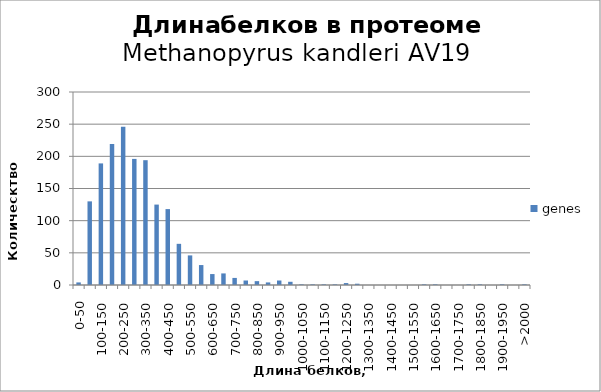
| Category | genes |
|---|---|
| 0-50 | 4 |
| 50-100 | 130 |
| 100-150 | 189 |
| 150-200 | 219 |
| 200-250 | 246 |
| 250-300 | 196 |
| 300-350 | 194 |
| 350-400 | 125 |
| 400-450 | 118 |
| 450-500 | 64 |
| 500-550 | 46 |
| 550-600 | 31 |
| 600-650 | 17 |
| 650-700 | 18 |
| 700-750 | 11 |
| 750-800 | 7 |
| 800-850 | 6 |
| 850-900 | 4 |
| 900-950 | 7 |
| 950-1000 | 5 |
| 1000-1050 | 1 |
| 1050-1100 | 1 |
| 1100-1150 | 1 |
| 1150-1200 | 1 |
| 1200-1250 | 3 |
| 1250-1300 | 2 |
| 1300-1350 | 0 |
| 1350-1400 | 0 |
| 1400-1450 | 0 |
| 1450-1500 | 0 |
| 1500-1550 | 0 |
| 1550-1600 | 1 |
| 1600-1650 | 1 |
| 1650-1700 | 0 |
| 1700-1750 | 0 |
| 1750-1800 | 1 |
| 1800-1850 | 1 |
| 1850-1900 | 0 |
| 1900-1950 | 1 |
| 1950-2000 | 0 |
| >2000 | 1 |